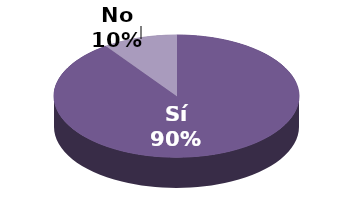
| Category | Series 1 |
|---|---|
| Sí | 37 |
| No | 4 |